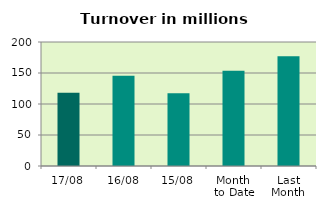
| Category | Series 0 |
|---|---|
| 17/08 | 118.182 |
| 16/08 | 145.751 |
| 15/08 | 117.15 |
| Month 
to Date | 153.499 |
| Last
Month | 177.022 |